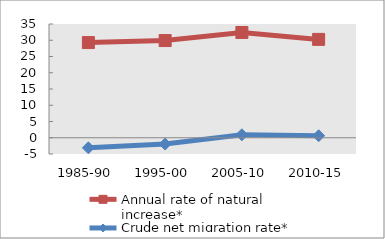
| Category | Annual rate of natural increase* | Crude net migration rate* |
|---|---|---|
| 1985-90 | 29.291 | -3.098 |
| 1995-00 | 29.908 | -1.941 |
| 2005-10 | 32.391 | 0.909 |
| 2010-15 | 30.26 | 0.619 |